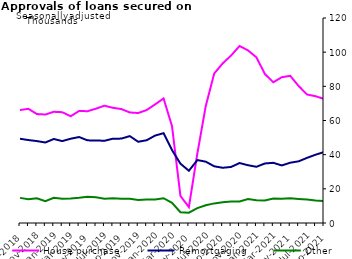
| Category | House purchase | Remortgaging | Other |
|---|---|---|---|
| Sep-2018 | 66132 | 49316 | 14700 |
| Oct-2018 | 66837 | 48548 | 13905 |
| Nov-2018 | 63780 | 47954 | 14445 |
| Dec-2018 | 63495 | 47125 | 12772 |
| Jan-2019 | 65091 | 49172 | 14807 |
| Feb-2019 | 64859 | 47932 | 14268 |
| Mar-2019 | 62488 | 49330 | 14320 |
| Apr-2019 | 65592 | 50330 | 14712 |
| May-2019 | 65443 | 48369 | 15313 |
| Jun-2019 | 66923 | 48344 | 15045 |
| Jul-2019 | 68667 | 48126 | 14246 |
| Aug-2019 | 67439 | 49360 | 14535 |
| Sep-2019 | 66690 | 49396 | 14160 |
| Oct-2019 | 64703 | 50869 | 14162 |
| Nov-2019 | 64379 | 47564 | 13479 |
| Dec-2019 | 66119 | 48440 | 13815 |
| Jan-2020 | 69432 | 51175 | 13776 |
| Feb-2020 | 72911 | 52588 | 14496 |
| Mar-2020 | 56730 | 42693 | 11849 |
| Apr-2020 | 15844 | 34729 | 6328 |
| May-2020 | 9309 | 30571 | 6043 |
| Jun-2020 | 40596 | 36834 | 8689 |
| Jul-2020 | 68544 | 35896 | 10424 |
| Aug-2020 | 87516 | 33194 | 11477 |
| Sep-2020 | 93409 | 32326 | 12187 |
| Oct-2020 | 98047 | 32815 | 12631 |
| Nov-2020 | 103600 | 35099 | 12656 |
| Dec-2020 | 101056 | 33823 | 13975 |
| Jan-2021 | 96948 | 32908 | 13372 |
| Feb-2021 | 87198 | 34851 | 13207 |
| Mar-2021 | 82383 | 35227 | 14344 |
| Apr-2021 | 85341 | 33697 | 14228 |
| May-2021 | 86143 | 35291 | 14484 |
| Jun-2021 | 80159 | 36109 | 14111 |
| Jul-2021 | 75191 | 38144 | 13695 |
| Aug-2021 | 74214 | 39978 | 13181 |
| Sep-2021 | 72645 | 41528 | 12796 |